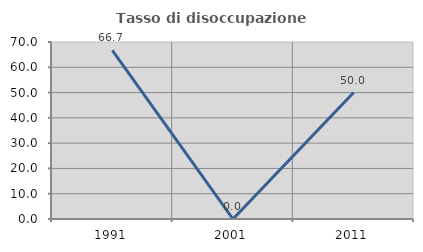
| Category | Tasso di disoccupazione giovanile  |
|---|---|
| 1991.0 | 66.667 |
| 2001.0 | 0 |
| 2011.0 | 50 |